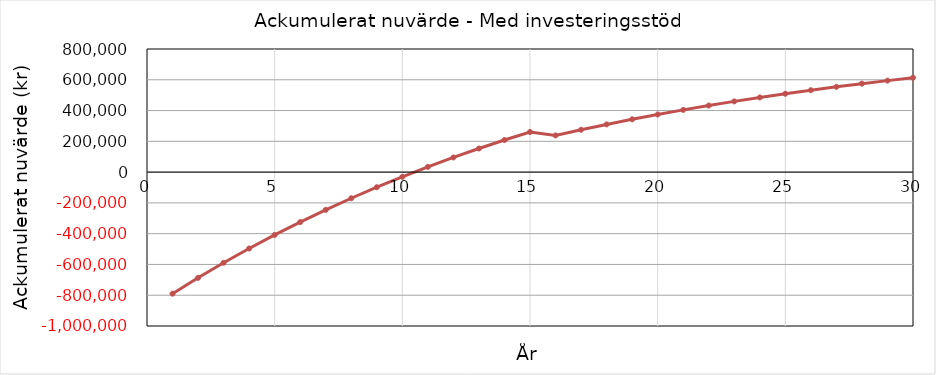
| Category | Ackumulerat |
|---|---|
| 0 | -790000 |
| 1 | -686993.595 |
| 2 | -589213.772 |
| 3 | -496395.417 |
| 4 | -408286.861 |
| 5 | -324649.194 |
| 6 | -245255.624 |
| 7 | -169890.86 |
| 8 | -98350.527 |
| 9 | -30440.616 |
| 10 | 34023.044 |
| 11 | 95215.283 |
| 12 | 153302.067 |
| 13 | 208440.941 |
| 14 | 260781.463 |
| 15 | 238313.039 |
| 16 | 275085.28 |
| 17 | 309988.31 |
| 18 | 343117.102 |
| 19 | 374561.807 |
| 20 | 404407.996 |
| 21 | 432736.895 |
| 22 | 459625.603 |
| 23 | 485147.305 |
| 24 | 509371.467 |
| 25 | 532364.026 |
| 26 | 554187.571 |
| 27 | 574901.511 |
| 28 | 594562.238 |
| 29 | 613223.277 |
| 30 | 630935.437 |
| 31 | 0 |
| 32 | 0 |
| 33 | 0 |
| 34 | 0 |
| 35 | 0 |
| 36 | 0 |
| 37 | 0 |
| 38 | 0 |
| 39 | 0 |
| 40 | 0 |
| 41 | 0 |
| 42 | 0 |
| 43 | 0 |
| 44 | 0 |
| 45 | 0 |
| 46 | 0 |
| 47 | 0 |
| 48 | 0 |
| 49 | 0 |
| 50 | 0 |